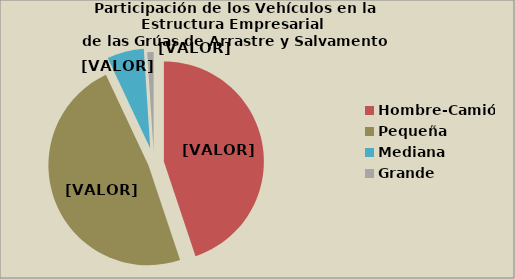
| Category | Series 0 |
|---|---|
| Hombre-Camión | 44.875 |
| Pequeña | 48.133 |
| Mediana | 5.958 |
| Grande | 1.034 |